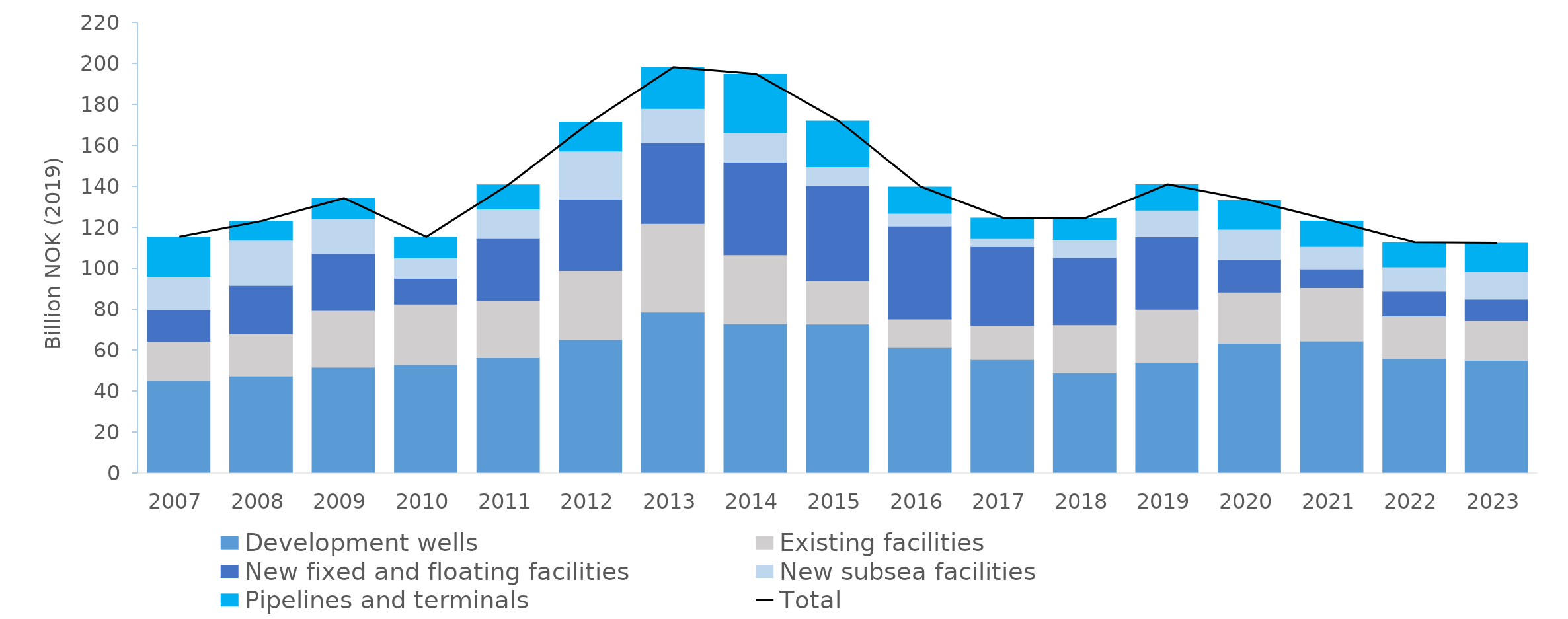
| Category | Development wells | Existing facilities | New fixed and floating facilities | New subsea facilities | Pipelines and terminals |
|---|---|---|---|---|---|
| 2007.0 | 45.377 | 19.153 | 15.271 | 16.367 | 19.24 |
| 2008.0 | 47.521 | 20.557 | 23.575 | 22.12 | 9.339 |
| 2009.0 | 51.78 | 27.728 | 27.846 | 17.028 | 9.821 |
| 2010.0 | 53.069 | 29.558 | 12.507 | 10.099 | 10.147 |
| 2011.0 | 56.439 | 27.959 | 30.206 | 14.416 | 11.895 |
| 2012.0 | 65.343 | 33.717 | 34.815 | 23.48 | 14.278 |
| 2013.0 | 78.618 | 43.434 | 39.296 | 16.792 | 19.988 |
| 2014.0 | 72.963 | 33.727 | 45.227 | 14.424 | 28.506 |
| 2015.0 | 72.785 | 21.207 | 46.452 | 9.249 | 22.428 |
| 2016.0 | 61.386 | 13.934 | 45.391 | 6.24 | 12.9 |
| 2017.0 | 55.537 | 16.704 | 38.38 | 3.949 | 10.118 |
| 2018.0 | 49.107 | 23.421 | 32.806 | 8.861 | 10.34 |
| 2019.0 | 54.035 | 26.015 | 35.468 | 12.926 | 12.516 |
| 2020.0 | 63.517 | 24.911 | 15.907 | 14.859 | 14.113 |
| 2021.0 | 64.597 | 26.066 | 9.092 | 10.944 | 12.545 |
| 2022.0 | 55.946 | 20.846 | 12.068 | 11.927 | 11.894 |
| 2023.0 | 55.173 | 19.364 | 10.496 | 13.543 | 13.822 |